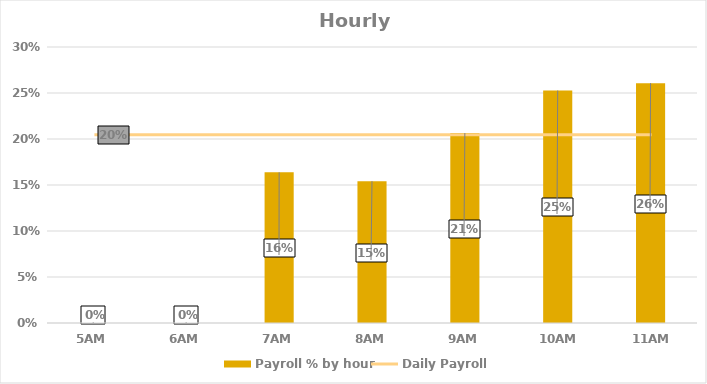
| Category | Payroll % by hour |
|---|---|
| 5AM | 0 |
| 6AM | 0 |
| 7AM | 0.164 |
| 8AM | 0.154 |
| 9AM | 0.206 |
| 10AM | 0.253 |
| 11AM | 0.261 |